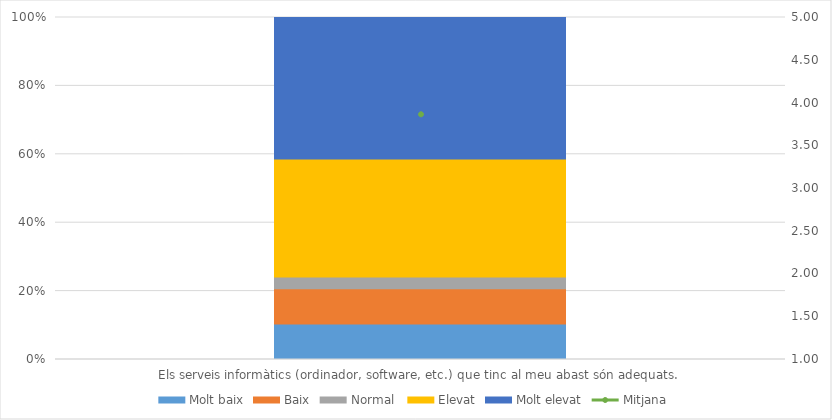
| Category | Molt baix | Baix | Normal  | Elevat | Molt elevat |
|---|---|---|---|---|---|
| Els serveis informàtics (ordinador, software, etc.) que tinc al meu abast són adequats. | 3 | 3 | 1 | 10 | 12 |